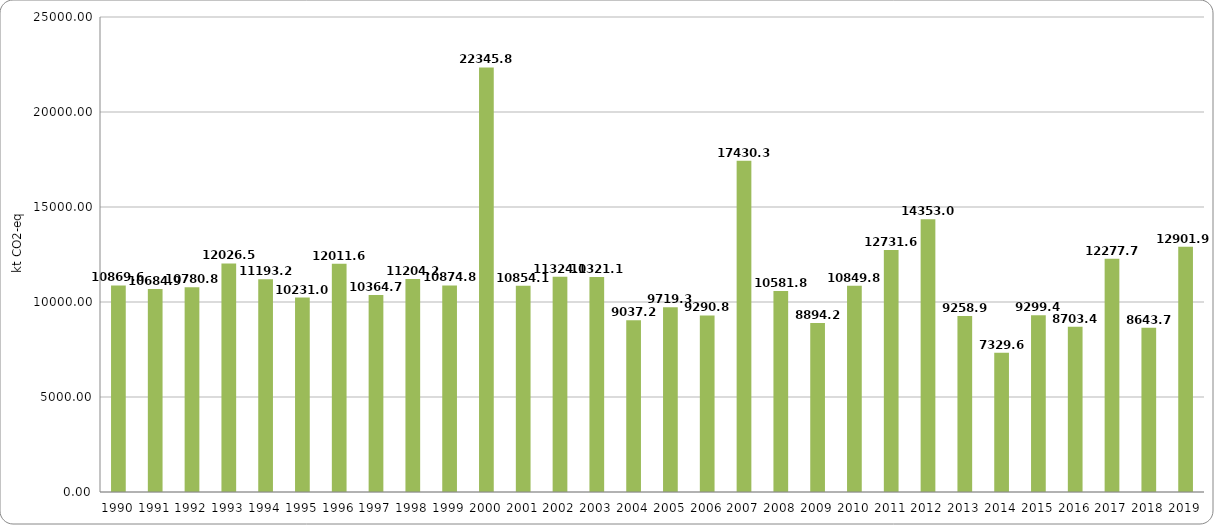
| Category | Вкупно (нето емисии) |
|---|---|
| 1990.0 | 10869.6 |
| 1991.0 | 10684.94 |
| 1992.0 | 10780.872 |
| 1993.0 | 12026.566 |
| 1994.0 | 11193.201 |
| 1995.0 | 10231.048 |
| 1996.0 | 12011.624 |
| 1997.0 | 10364.726 |
| 1998.0 | 11204.198 |
| 1999.0 | 10874.836 |
| 2000.0 | 22345.877 |
| 2001.0 | 10854.127 |
| 2002.0 | 11324.06 |
| 2003.0 | 11321.167 |
| 2004.0 | 9037.203 |
| 2005.0 | 9719.387 |
| 2006.0 | 9290.799 |
| 2007.0 | 17430.295 |
| 2008.0 | 10581.818 |
| 2009.0 | 8894.259 |
| 2010.0 | 10849.847 |
| 2011.0 | 12731.626 |
| 2012.0 | 14353.043 |
| 2013.0 | 9258.984 |
| 2014.0 | 7329.654 |
| 2015.0 | 9299.41 |
| 2016.0 | 8703.469 |
| 2017.0 | 12277.706 |
| 2018.0 | 8643.7 |
| 2019.0 | 12901.94 |